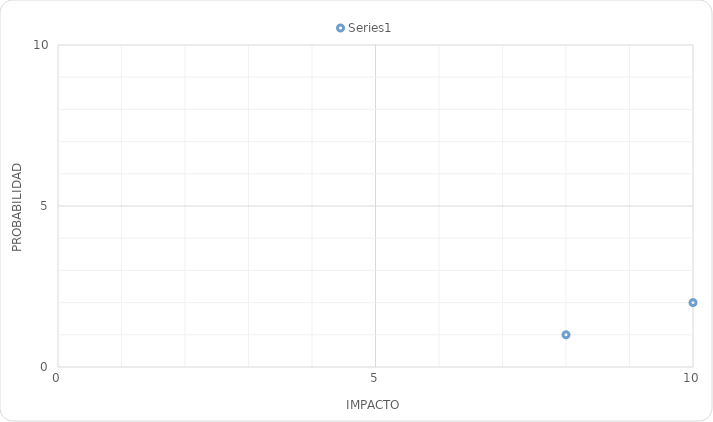
| Category | Series 0 |
|---|---|
| 8.0 | 1 |
| 10.0 | 2 |